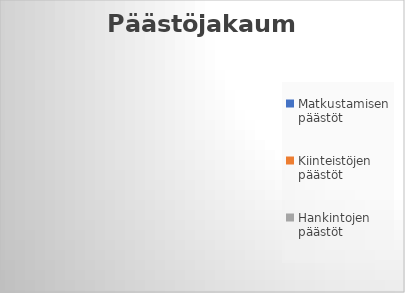
| Category | Series 0 |
|---|---|
| Matkustamisen päästöt | 0 |
| Kiinteistöjen päästöt | 0 |
| Hankintojen päästöt | 0 |